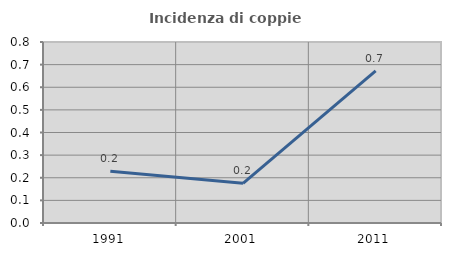
| Category | Incidenza di coppie miste |
|---|---|
| 1991.0 | 0.229 |
| 2001.0 | 0.175 |
| 2011.0 | 0.672 |